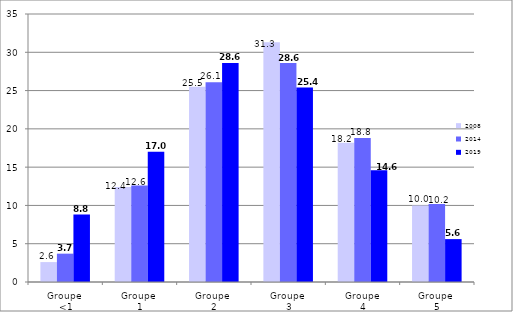
| Category | 2008 | 2014 | 2019 |
|---|---|---|---|
| Groupe 
<1 | 2.6 | 3.7 | 8.8 |
| Groupe 
1 | 12.4 | 12.6 | 17 |
| Groupe 
2 | 25.5 | 26.1 | 28.6 |
| Groupe 
3 | 31.3 | 28.6 | 25.4 |
| Groupe
4 | 18.2 | 18.8 | 14.6 |
| Groupe 
5 | 10 | 10.2 | 5.6 |